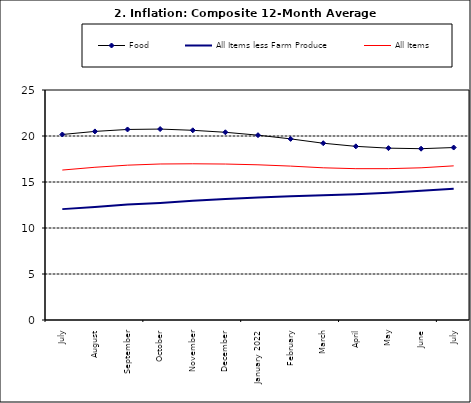
| Category | Food | All Items less Farm Produce | All Items |
|---|---|---|---|
| July | 20.165 | 12.052 | 16.298 |
| August | 20.499 | 12.291 | 16.601 |
| September | 20.711 | 12.553 | 16.83 |
| October | 20.753 | 12.725 | 16.958 |
| November | 20.619 | 12.956 | 16.979 |
| December | 20.403 | 13.161 | 16.953 |
| January 2022 | 20.089 | 13.326 | 16.869 |
| February | 19.687 | 13.461 | 16.728 |
| March | 19.214 | 13.562 | 16.544 |
| April | 18.876 | 13.681 | 16.449 |
| May | 18.679 | 13.83 | 16.449 |
| June | 18.619 | 14.057 | 16.542 |
| July | 18.745 | 14.278 | 16.755 |